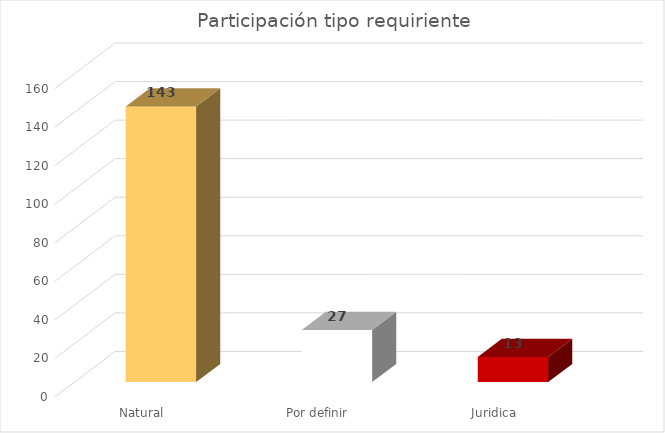
| Category | Total |
|---|---|
| Natural | 143 |
| Por definir | 27 |
| Juridica | 13 |